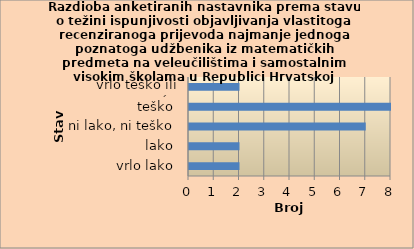
| Category | Series 0 |
|---|---|
| vrlo lako | 2 |
| lako | 2 |
| ni lako, ni teško | 7 |
| teško | 8 |
| vrlo teško ili nemoguće | 2 |